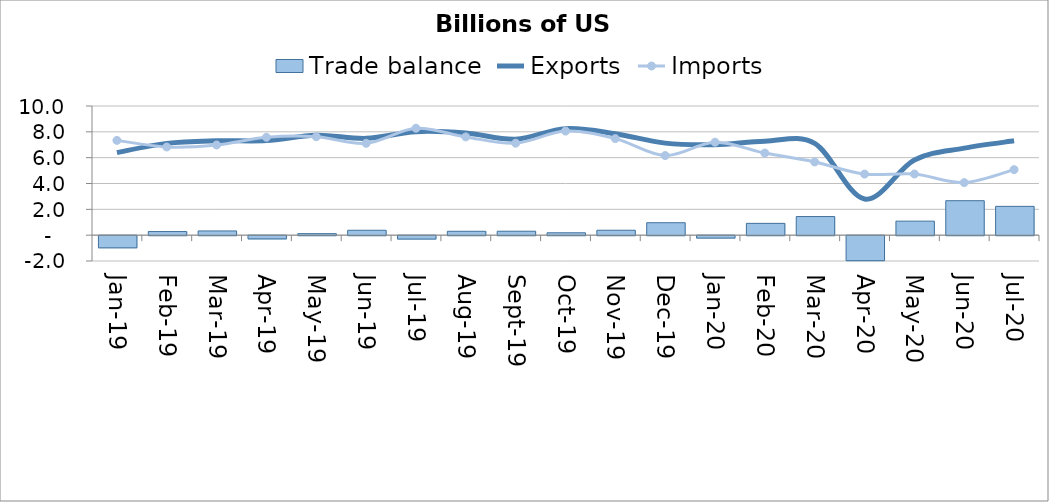
| Category | Trade balance |
|---|---|
| 2019-01-31 | -0.943 |
| 2019-02-28 | 0.28 |
| 2019-03-31 | 0.327 |
| 2019-04-30 | -0.249 |
| 2019-05-31 | 0.117 |
| 2019-06-30 | 0.38 |
| 2019-07-31 | -0.265 |
| 2019-08-31 | 0.3 |
| 2019-09-30 | 0.305 |
| 2019-10-31 | 0.185 |
| 2019-11-30 | 0.381 |
| 2019-12-01 | 0.963 |
| 2020-01-31 | -0.189 |
| 2020-02-29 | 0.913 |
| 2020-03-31 | 1.441 |
| 2020-04-30 | -1.935 |
| 2020-05-31 | 1.085 |
| 2020-06-30 | 2.669 |
| 2020-07-31 | 2.231 |